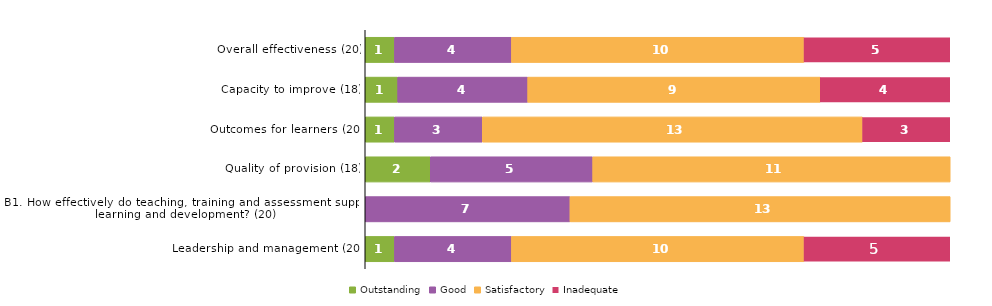
| Category | Outstanding | Good | Satisfactory | Inadequate |
|---|---|---|---|---|
| Overall effectiveness (20) | 1 | 4 | 10 | 5 |
| Capacity to improve (18) | 1 | 4 | 9 | 4 |
| Outcomes for learners (20) | 1 | 3 | 13 | 3 |
| Quality of provision (18) | 2 | 5 | 11 | 0 |
| B1. How effectively do teaching, training and assessment support learning and development? (20) | 0 | 7 | 13 | 0 |
| Leadership and management (20) | 1 | 4 | 10 | 5 |